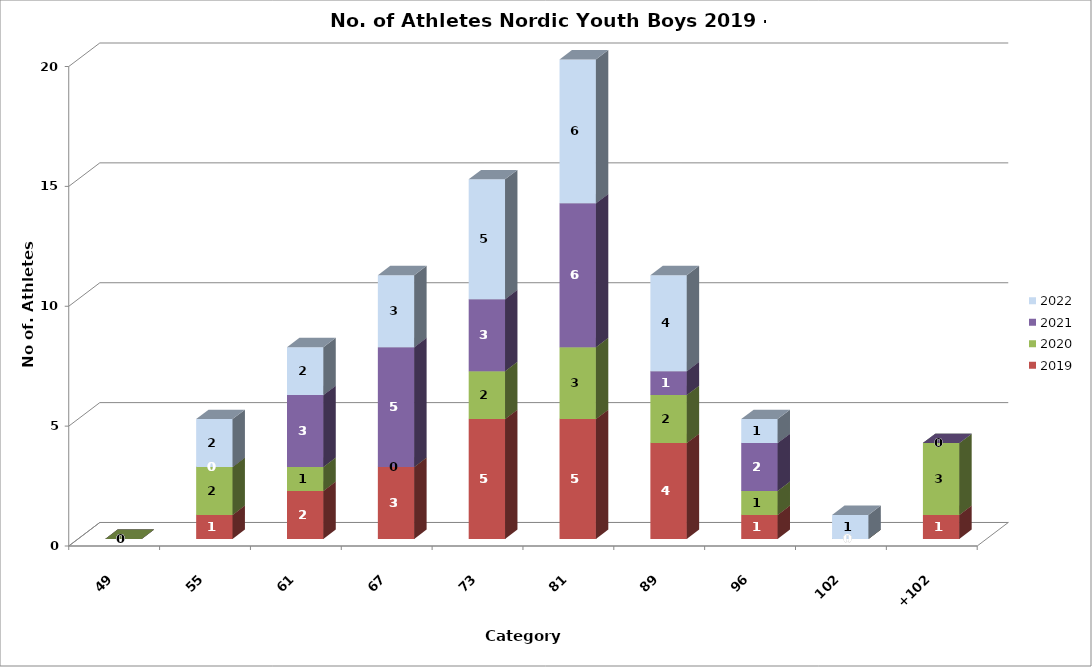
| Category | 2019 | 2020 | 2021 | 2022 |
|---|---|---|---|---|
| 49 | 0 | 0 | 0 | 0 |
| 55 | 1 | 2 | 0 | 2 |
| 61 | 2 | 1 | 3 | 2 |
| 67 | 3 | 0 | 5 | 3 |
| 73 | 5 | 2 | 3 | 5 |
| 81 | 5 | 3 | 6 | 6 |
| 89 | 4 | 2 | 1 | 4 |
| 96 | 1 | 1 | 2 | 1 |
| 102 | 0 | 0 | 0 | 1 |
| +102 | 1 | 3 | 0 | 0 |